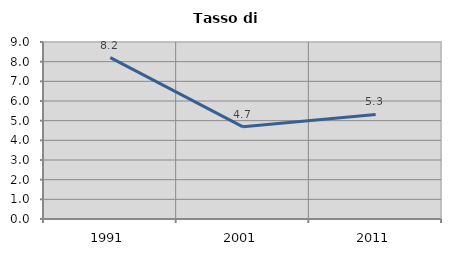
| Category | Tasso di disoccupazione   |
|---|---|
| 1991.0 | 8.209 |
| 2001.0 | 4.688 |
| 2011.0 | 5.316 |